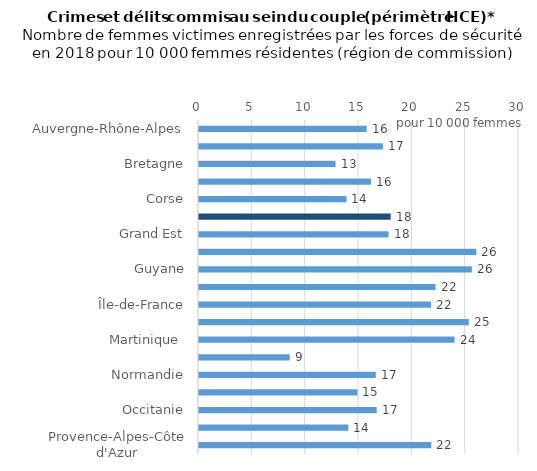
| Category | Series 0 |
|---|---|
| Auvergne-Rhône-Alpes | 15.725 |
| Bourgogne-Franche-Comté | 17.24 |
| Bretagne | 12.798 |
| Centre-Val de Loire | 16.125 |
| Corse | 13.828 |
| France métropolitaine | 17.972 |
| Grand Est | 17.776 |
| Guadeloupe  | 25.999 |
| Guyane | 25.58 |
| Hauts-de-France | 22.177 |
| Île-de-France | 21.757 |
| La Réunion | 25.297 |
| Martinique  | 23.96 |
| Mayotte | 8.507 |
| Normandie | 16.574 |
| Nouvelle-Aquitaine | 14.854 |
| Occitanie | 16.661 |
| Pays de la Loire | 13.994 |
| Provence-Alpes-Côte d'Azur | 21.773 |